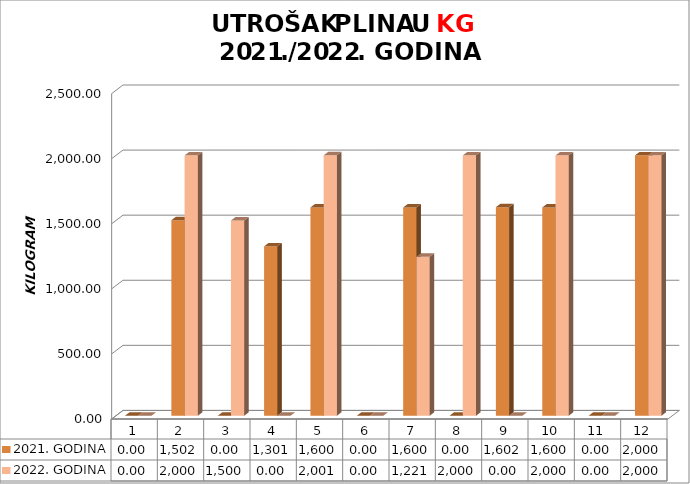
| Category | 2021. GODINA | 2022. GODINA |
|---|---|---|
| 0 | 0 | 0 |
| 1 | 1502 | 2000 |
| 2 | 0 | 1500 |
| 3 | 1301 | 0 |
| 4 | 1600 | 2001 |
| 5 | 0 | 0 |
| 6 | 1600 | 1221 |
| 7 | 0 | 2000 |
| 8 | 1602 | 0 |
| 9 | 1600 | 2000 |
| 10 | 0 | 0 |
| 11 | 2000 | 2000 |